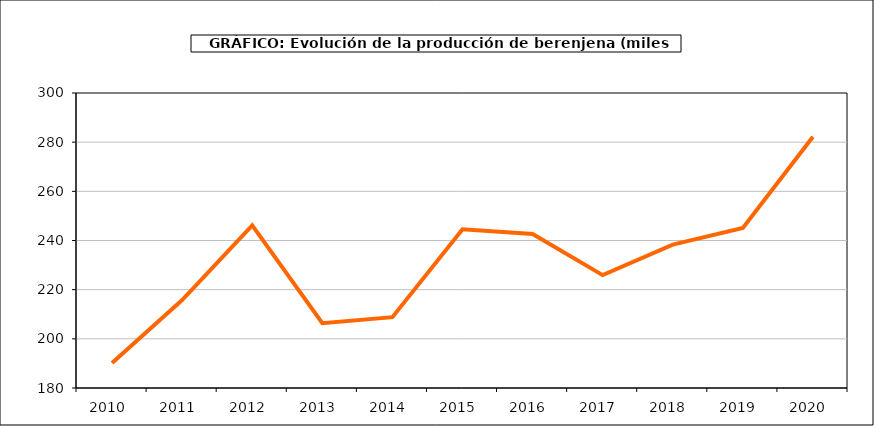
| Category | producción |
|---|---|
| 2010.0 | 190.195 |
| 2011.0 | 215.769 |
| 2012.0 | 246.142 |
| 2013.0 | 206.333 |
| 2014.0 | 208.821 |
| 2015.0 | 244.54 |
| 2016.0 | 242.643 |
| 2017.0 | 225.912 |
| 2018.0 | 238.325 |
| 2019.0 | 245.146 |
| 2020.0 | 282.2 |